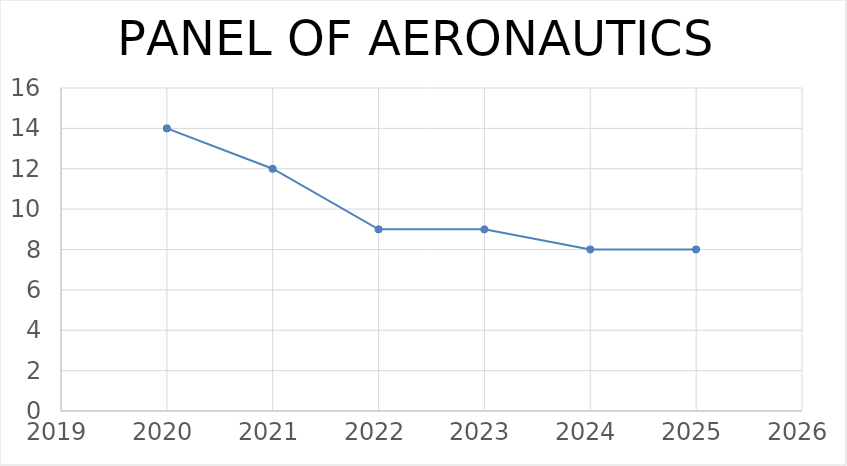
| Category | Series 0 |
|---|---|
| 2020.0 | 14 |
| 2021.0 | 12 |
| 2022.0 | 9 |
| 2023.0 | 9 |
| 2024.0 | 8 |
| 2025.0 | 8 |